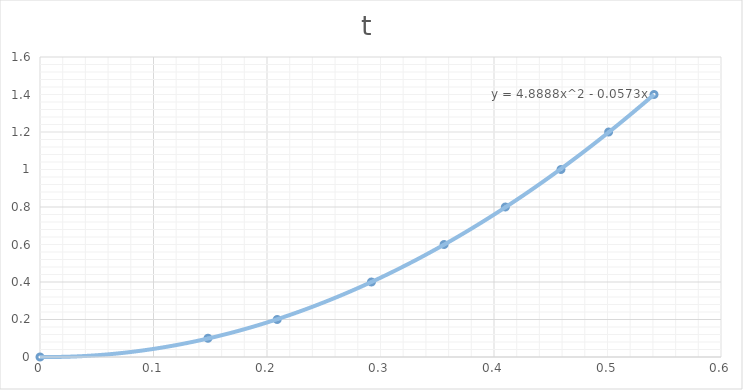
| Category | t |
|---|---|
| 0.0 | 0 |
| 0.148 | 0.1 |
| 0.209 | 0.2 |
| 0.292 | 0.4 |
| 0.356 | 0.6 |
| 0.41 | 0.8 |
| 0.459 | 1 |
| 0.501 | 1.2 |
| 0.541 | 1.4 |